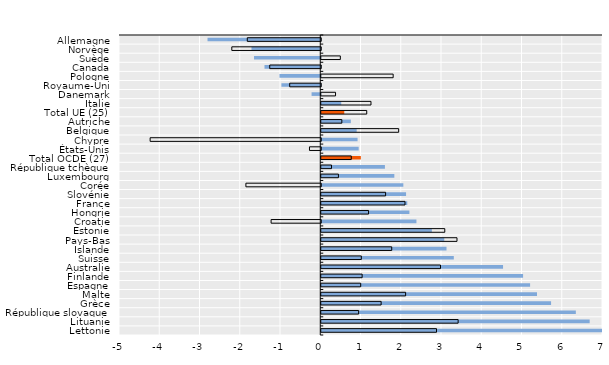
| Category | Nés à l’étranger | Nés dans le pays |
|---|---|---|
| Allemagne | -2.801 | -1.825 |
| Norvège | -1.709 | -2.21 |
| Suède | -1.646 | 0.474 |
| Canada | -1.385 | -1.267 |
| Pologne | -1.013 | 1.787 |
| Royaume-Uni | -0.965 | -0.771 |
| Danemark | -0.216 | 0.355 |
| Italie | 0.497 | 1.236 |
| Total UE (25) | 0.572 | 1.13 |
| Autriche | 0.735 | 0.512 |
| Belgique | 0.88 | 1.924 |
| Chypre | 0.902 | -4.239 |
| États-Unis | 0.93 | -0.28 |
| Total OCDE (27) | 0.983 | 0.746 |
| République tchèque | 1.582 | 0.255 |
| Luxembourg | 1.816 | 0.427 |
| Corée | 2.04 | -1.86 |
| Slovénie | 2.107 | 1.599 |
| France | 2.137 | 2.08 |
| Hongrie | 2.19 | 1.176 |
| Croatie | 2.365 | -1.234 |
| Estonie | 2.748 | 3.069 |
| Pays-Bas | 3.056 | 3.373 |
| Islande | 3.112 | 1.751 |
| Suisse | 3.293 | 0.996 |
| Australie | 4.517 | 2.963 |
| Finlande | 5.015 | 1.016 |
| Espagne | 5.189 | 0.98 |
| Malte | 5.36 | 2.096 |
| Grèce | 5.71 | 1.488 |
| République slovaque | 6.325 | 0.929 |
| Lituanie | 6.669 | 3.401 |
| Lettonie | 8.478 | 2.863 |